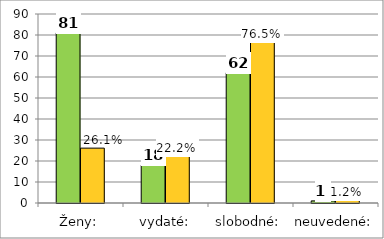
| Category | Series 0 | Series 1 |
|---|---|---|
| Ženy: | 81 | 26.129 |
| vydaté: | 18 | 22.222 |
| slobodné: | 62 | 76.543 |
| neuvedené: | 1 | 1.235 |